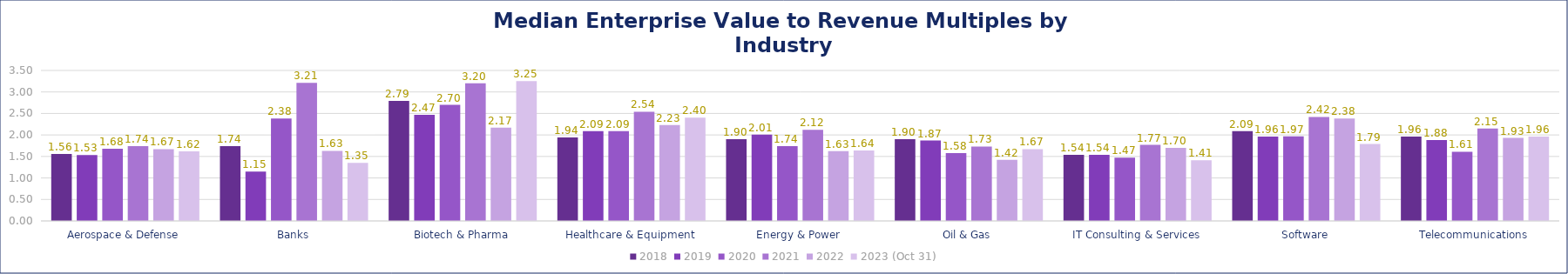
| Category | 2018 | 2019 | 2020 | 2021 | 2022 | 2023 (Oct 31) |
|---|---|---|---|---|---|---|
| Aerospace & Defense | 1.56 | 1.53 | 1.68 | 1.74 | 1.67 | 1.62 |
| Banks | 1.74 | 1.15 | 2.38 | 3.21 | 1.63 | 1.35 |
| Biotech & Pharma | 2.79 | 2.47 | 2.7 | 3.2 | 2.17 | 3.25 |
| Healthcare & Equipment | 1.94 | 2.09 | 2.09 | 2.54 | 2.23 | 2.4 |
| Energy & Power | 1.9 | 2.01 | 1.74 | 2.12 | 1.625 | 1.64 |
| Oil & Gas | 1.9 | 1.87 | 1.58 | 1.73 | 1.42 | 1.67 |
| IT Consulting & Services | 1.54 | 1.54 | 1.47 | 1.77 | 1.7 | 1.41 |
| Software | 2.09 | 1.96 | 1.97 | 2.42 | 2.38 | 1.79 |
| Telecommunications | 1.96 | 1.88 | 1.61 | 2.15 | 1.93 | 1.96 |